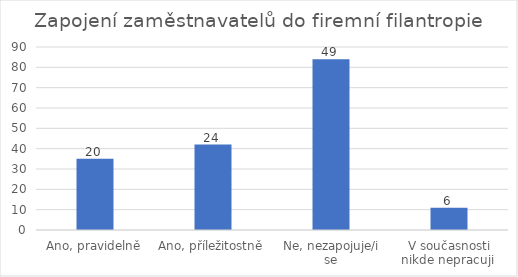
| Category | Počet respondentů |
|---|---|
| Ano, pravidelně | 35 |
| Ano, příležitostně | 42 |
| Ne, nezapojuje/i se | 84 |
| V současnosti nikde nepracuji  | 11 |